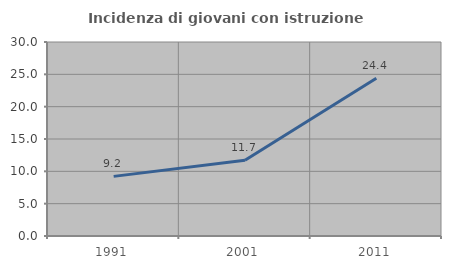
| Category | Incidenza di giovani con istruzione universitaria |
|---|---|
| 1991.0 | 9.22 |
| 2001.0 | 11.722 |
| 2011.0 | 24.39 |